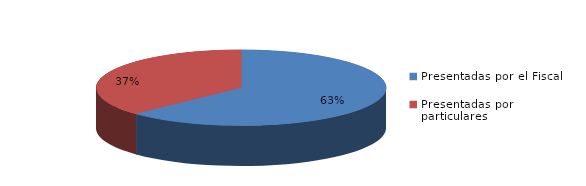
| Category | Series 0 |
|---|---|
| Presentadas por el Fiscal | 142 |
| Presentadas por particulares | 84 |